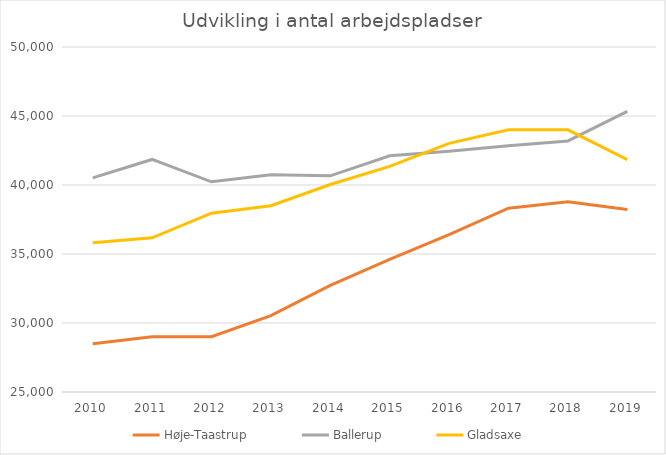
| Category | Høje-Taastrup | Ballerup | Gladsaxe |
|---|---|---|---|
| 2010.0 | 28499 | 40521 | 35821 |
| 2011.0 | 29002 | 41852 | 36175 |
| 2012.0 | 29006 | 40231 | 37956 |
| 2013.0 | 30539 | 40743 | 38499 |
| 2014.0 | 32727 | 40665 | 40036 |
| 2015.0 | 34606 | 42122 | 41350 |
| 2016.0 | 36396 | 42448 | 43014 |
| 2017.0 | 38321 | 42846 | 43996 |
| 2018.0 | 38781 | 43191 | 43995 |
| 2019.0 | 38223 | 45340 | 41839 |